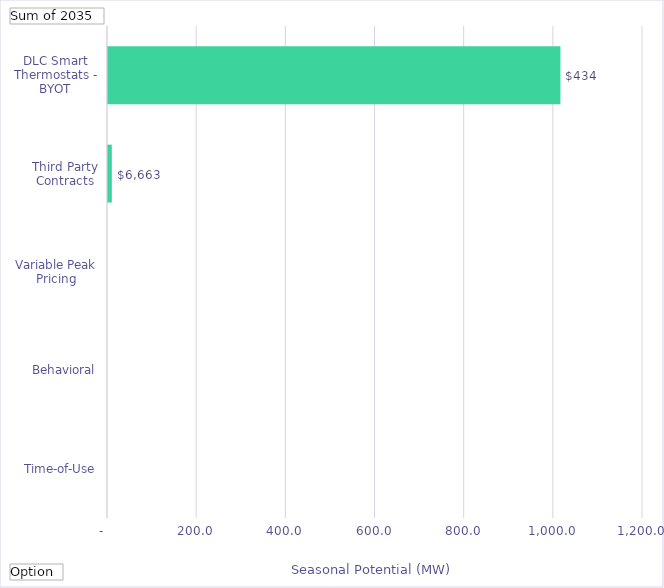
| Category | Winter Peak Reduction @Meter  (Therms) |
|---|---|
| Time-of-Use | 0 |
| Behavioral | 0 |
| Variable Peak Pricing | 0 |
| Third Party Contracts | 8.523 |
| DLC Smart Thermostats - BYOT | 1014.782 |